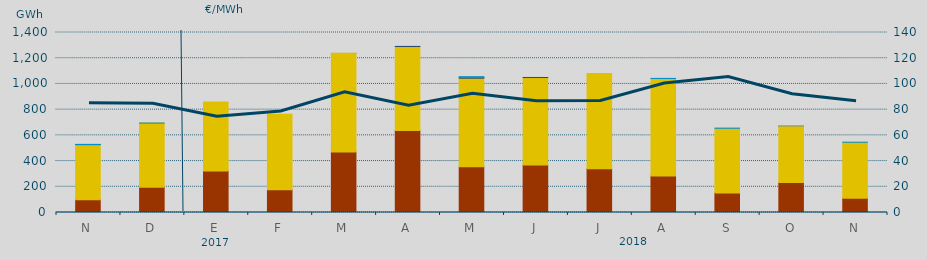
| Category | Carbón | Ciclo Combinado | Consumo Bombeo | Hidráulica | Otras Renovables |
|---|---|---|---|---|---|
| N | 99779.8 | 428275.6 | 370 | 1458.4 | 0 |
| D | 195559 | 499810.1 | 0 | 237.7 | 0 |
| E | 323414.2 | 535924.4 | 0 | 0 | 0 |
| F | 176086.6 | 587965.4 | 0 | 0 | 0 |
| M | 469679.3 | 766935.8 | 0 | 790 | 1096.8 |
| A | 637382 | 653437.2 | 1000 | 0 | 0 |
| M | 356322 | 688216.9 | 5321 | 6699 | 0 |
| J | 368722 | 680942.3 | 583.4 | 0 | 0 |
| J | 340015 | 740572.3 | 0 | 0 | 0 |
| A | 283796.9 | 758484.6 | 0 | 758.5 | 0 |
| S | 151862.8 | 503288.5 | 0 | 711.8 | 0 |
| O | 233100.2 | 436412.2 | 1448.2 | 441.9 | 60.2 |
| N | 110342 | 436088.1 | 0 | 152 | 0 |